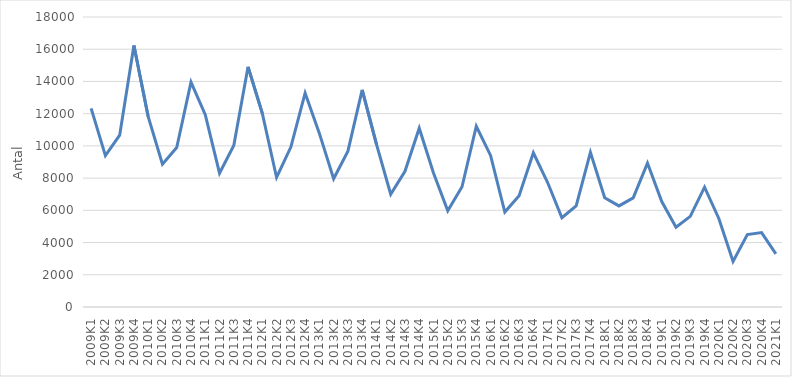
| Category | Antal |
|---|---|
| 2009K1 | 12330 |
| 2009K2 | 9391 |
| 2009K3 | 10665 |
| 2009K4 | 16228 |
| 2010K1 | 11808 |
| 2010K2 | 8867 |
| 2010K3 | 9897 |
| 2010K4 | 13961 |
| 2011K1 | 11934 |
| 2011K2 | 8306 |
| 2011K3 | 10027 |
| 2011K4 | 14906 |
| 2012K1 | 12020 |
| 2012K2 | 8038 |
| 2012K3 | 9930 |
| 2012K4 | 13278 |
| 2013K1 | 10776 |
| 2013K2 | 7957 |
| 2013K3 | 9673 |
| 2013K4 | 13482 |
| 2014K1 | 10106 |
| 2014K2 | 7000 |
| 2014K3 | 8424 |
| 2014K4 | 11098 |
| 2015K1 | 8322 |
| 2015K2 | 5973 |
| 2015K3 | 7461 |
| 2015K4 | 11218 |
| 2016K1 | 9407 |
| 2016K2 | 5892 |
| 2016K3 | 6908 |
| 2016K4 | 9570 |
| 2017K1 | 7726 |
| 2017K2 | 5542 |
| 2017K3 | 6273 |
| 2017K4 | 9596 |
| 2018K1 | 6783 |
| 2018K2 | 6275 |
| 2018K3 | 6775 |
| 2018K4 | 8932 |
| 2019K1 | 6542 |
| 2019K2 | 4947 |
| 2019K3 | 5627 |
| 2019K4 | 7437 |
| 2020K1 | 5496 |
| 2020K2 | 2826 |
| 2020K3 | 4492 |
| 2020K4 | 4616 |
| 2021K1 | 3294 |